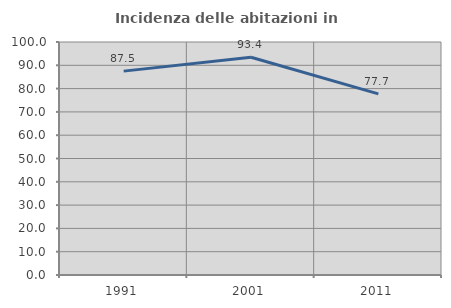
| Category | Incidenza delle abitazioni in proprietà  |
|---|---|
| 1991.0 | 87.5 |
| 2001.0 | 93.438 |
| 2011.0 | 77.746 |